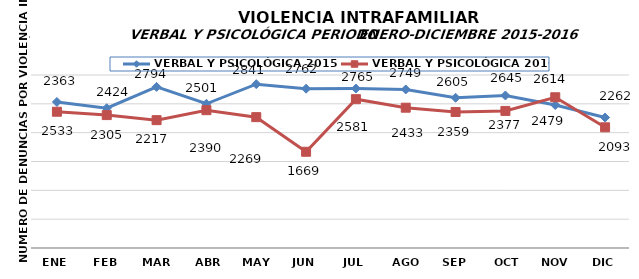
| Category | VERBAL Y PSICOLÓGICA 2015 | VERBAL Y PSICOLÓGICA 2016 |
|---|---|---|
| ENE | 2533 | 2363 |
| FEB | 2424 | 2305 |
| MAR | 2794 | 2217 |
| ABR | 2501 | 2390 |
| MAY | 2841 | 2269 |
| JUN | 2762 | 1669 |
| JUL | 2765 | 2581 |
| AGO | 2749 | 2433 |
| SEP | 2605 | 2359 |
| OCT | 2645 | 2377 |
| NOV | 2479 | 2614 |
| DIC | 2262 | 2093 |